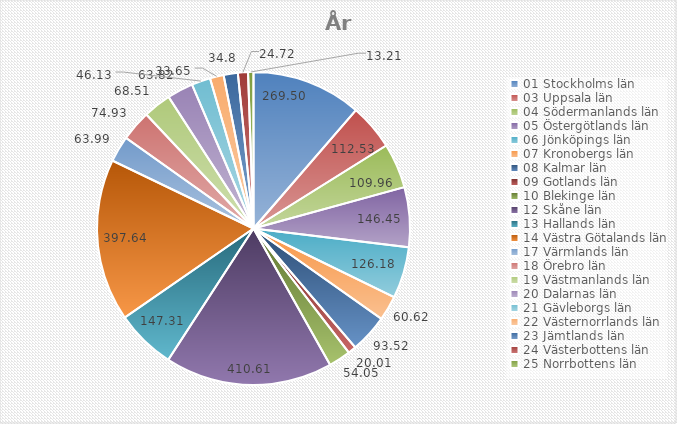
| Category | Series 0 |
|---|---|
| 01 Stockholms län | 269.5 |
| 03 Uppsala län | 112.53 |
| 04 Södermanlands län | 109.96 |
| 05 Östergötlands län | 146.45 |
| 06 Jönköpings län | 126.18 |
| 07 Kronobergs län | 60.62 |
| 08 Kalmar län | 93.52 |
| 09 Gotlands län | 20.01 |
| 10 Blekinge län | 54.05 |
| 12 Skåne län | 410.61 |
| 13 Hallands län | 147.31 |
| 14 Västra Götalands län | 397.64 |
| 17 Värmlands län | 63.99 |
| 18 Örebro län | 74.93 |
| 19 Västmanlands län | 68.51 |
| 20 Dalarnas län | 63.82 |
| 21 Gävleborgs län | 46.13 |
| 22 Västernorrlands län | 33.65 |
| 23 Jämtlands län | 34.8 |
| 24 Västerbottens län | 24.72 |
| 25 Norrbottens län | 13.21 |